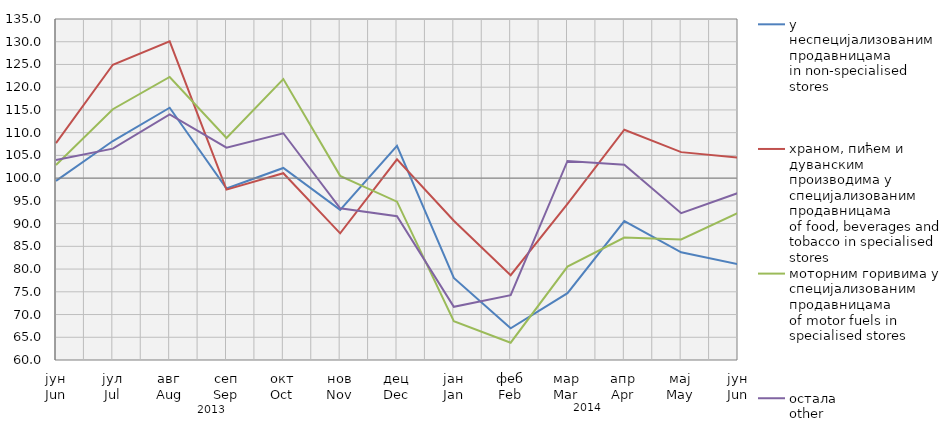
| Category | у неспецијализованим продавницама
in non-specialised stores | храном, пићем и дуванским производима у специјализовaним продавницама
of food, beverages and tobacco in specialised stores | моторним горивима у специјализованим продавницама
of motor fuels in specialised stores | остала
other |
|---|---|---|---|---|
| јун
Jun | 99.408 | 107.704 | 102.888 | 103.986 |
| јул
Jul | 108.16 | 124.929 | 115.152 | 106.482 |
| авг
Aug | 115.48 | 130.093 | 122.253 | 113.997 |
| сеп
Sep | 97.717 | 97.467 | 108.827 | 106.7 |
| окт
Oct | 102.24 | 101.077 | 121.799 | 109.868 |
| нов
Nov | 93.024 | 87.862 | 100.498 | 93.38 |
| дец
Dec | 107.124 | 104.135 | 94.83 | 91.634 |
| јан
Jan | 78.06 | 90.633 | 68.559 | 71.709 |
| феб
Feb | 66.985 | 78.662 | 63.807 | 74.254 |
| мар
Mar | 74.689 | 94.336 | 80.553 | 103.781 |
| апр
Apr | 90.551 | 110.647 | 86.935 | 102.941 |
| мај
May | 83.686 | 105.717 | 86.504 | 92.281 |
| јун
Jun | 81.058 | 104.523 | 92.36 | 96.738 |